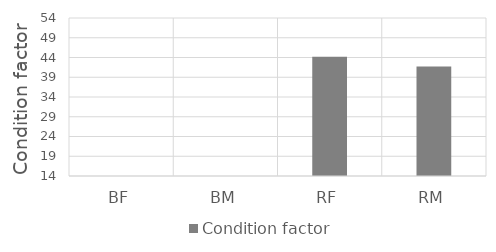
| Category | Condition factor |
|---|---|
| BF | 0 |
| BM | 0 |
| RF | 44.2 |
| RM | 41.7 |